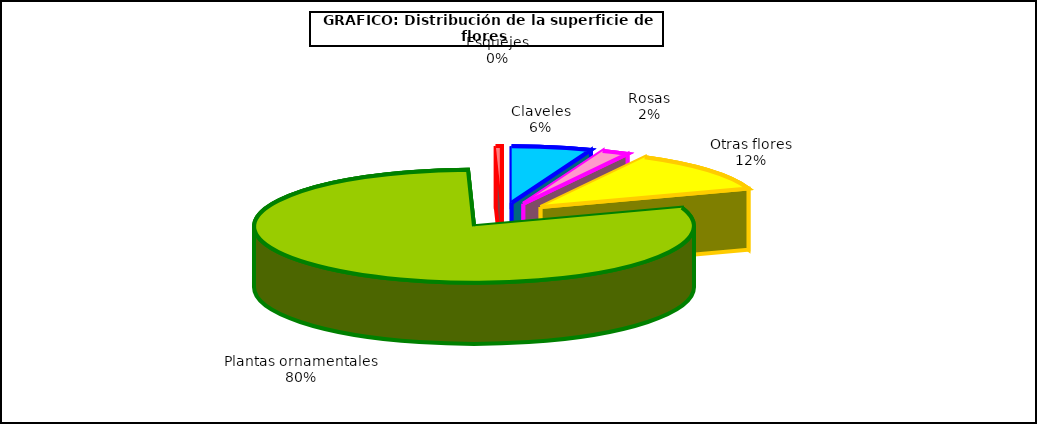
| Category | Series 0 |
|---|---|
| 0 | 41501 |
| 1 | 14063 |
| 2 | 83843 |
| 3 | 565565 |
| 4 | 3080 |